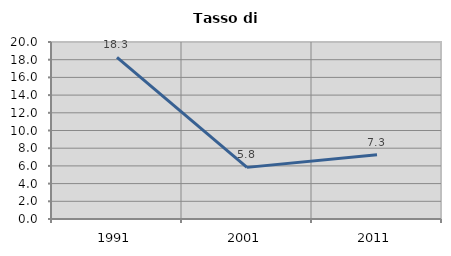
| Category | Tasso di disoccupazione   |
|---|---|
| 1991.0 | 18.261 |
| 2001.0 | 5.833 |
| 2011.0 | 7.258 |